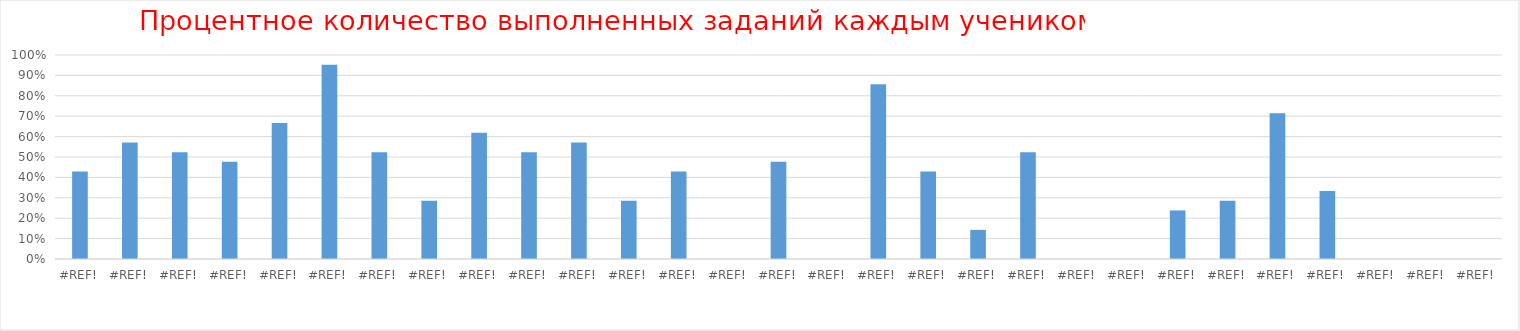
| Category | Series 0 |
|---|---|
| 0.0 | 0.429 |
| 0.0 | 0.571 |
| 0.0 | 0.524 |
| 0.0 | 0.476 |
| 0.0 | 0.667 |
| 0.0 | 0.952 |
| 0.0 | 0.524 |
| 0.0 | 0.286 |
| 0.0 | 0.619 |
| 0.0 | 0.524 |
| 0.0 | 0.571 |
| 0.0 | 0.286 |
| 0.0 | 0.429 |
| 0.0 | 0 |
| 0.0 | 0.476 |
| 0.0 | 0 |
| 0.0 | 0.857 |
| 0.0 | 0.429 |
| 0.0 | 0.143 |
| 0.0 | 0.524 |
| 0.0 | 0 |
| 0.0 | 0 |
| 0.0 | 0.238 |
| 0.0 | 0.286 |
| 0.0 | 0.714 |
| 0.0 | 0.333 |
| 0.0 | 0 |
| 0.0 | 0 |
| 0.0 | 0 |